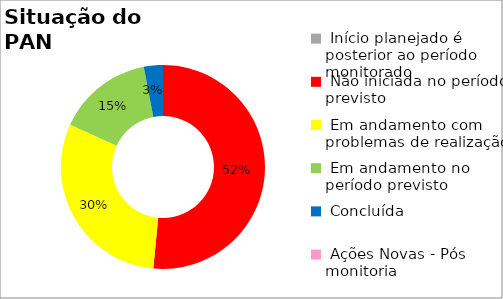
| Category | Series 0 |
|---|---|
|  Início planejado é posterior ao período monitorado | 0 |
|  Não iniciada no período previsto | 0.515 |
|  Em andamento com problemas de realização | 0.303 |
|  Em andamento no período previsto  | 0.152 |
|  Concluída | 0.03 |
|  Ações Novas - Pós monitoria | 0 |